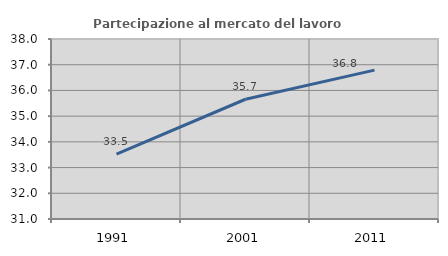
| Category | Partecipazione al mercato del lavoro  femminile |
|---|---|
| 1991.0 | 33.522 |
| 2001.0 | 35.657 |
| 2011.0 | 36.791 |